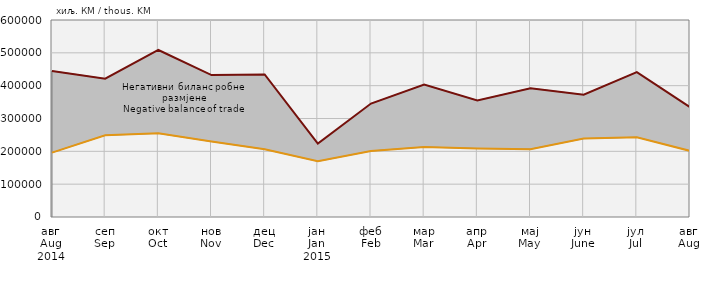
| Category | Series 1 | Series 2 |
|---|---|---|
| 0 | 195984 | 444841 |
| 1 | 248813 | 421218 |
| 2 | 254767 | 508654 |
| 3 | 229828 | 432236 |
| 4 | 206415 | 434262 |
| 5 | 169568 | 223487 |
| 6 | 201039 | 345476 |
| 7 | 213208 | 403130 |
| 8 | 208576 | 354876 |
| 9 | 206720 | 392249 |
| 10 | 238732 | 372531 |
| 11 | 242893 | 441257 |
| 12 | 201362 | 334662 |